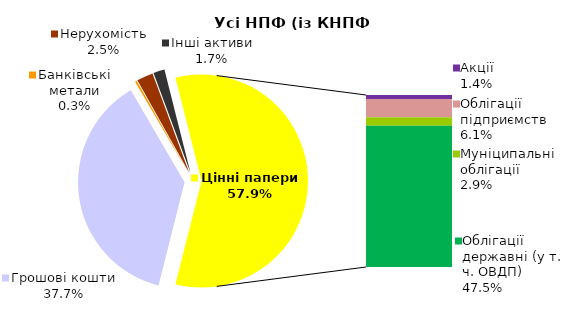
| Category | Усі НПФ (із КНПФ НБУ)* |
|---|---|
| Грошові кошти | 1370.49 |
| Банківські метали | 10.485 |
| Нерухомість | 90.355 |
| Інші активи | 62.073 |
| Акції | 50.412 |
| Облігації підприємств | 221.426 |
| Муніципальні облігації | 104.799 |
| Облігації державні (у т. ч. ОВДП) | 1729.563 |